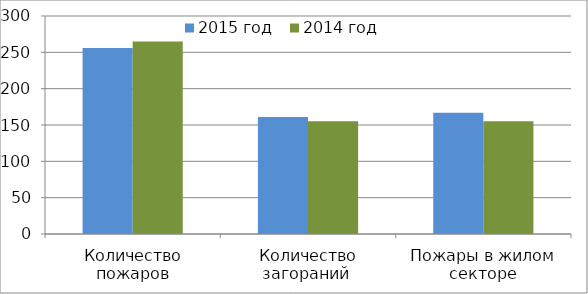
| Category | 2015 год | 2014 год |
|---|---|---|
| Количество пожаров | 256 | 265 |
| Количество загораний  | 161 | 155 |
| Пожары в жилом секторе | 167 | 155 |